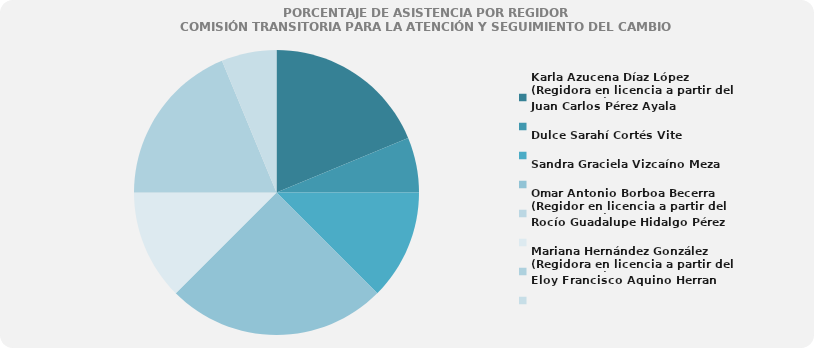
| Category | Karla Azucena Díaz López
(Regidora en licencia a partir del 01/03/2024) |
|---|---|
| Karla Azucena Díaz López
(Regidora en licencia a partir del 01/03/2024) | 75 |
| Juan Carlos Pérez Ayala  | 25 |
| Dulce Sarahí Cortés Vite | 50 |
| Sandra Graciela Vizcaíno Meza | 100 |
| Omar Antonio Borboa Becerra 
(Regidor en licencia a partir del 16/02/2024)  | 0 |
| Rocío Guadalupe Hidalgo Pérez | 50 |
| Mariana Hernández González
(Regidora en licencia a partir del 01/03/2024) | 75 |
| Eloy Francisco Aquino Herran | 25 |